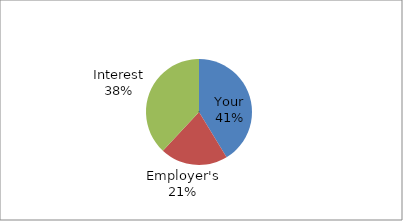
| Category | Series 0 |
|---|---|
| Your | 44637.393 |
| Employer's | 22318.697 |
| Interest | 41139.681 |